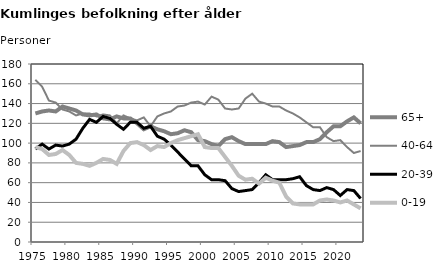
| Category | 65+ | 40-64 | 20-39 | 0-19 |
|---|---|---|---|---|
| 1975.0 | 130 | 164 | 94 | 96 |
| 1976.0 | 132 | 157 | 99 | 94 |
| 1977.0 | 133 | 143 | 94 | 88 |
| 1978.0 | 132 | 141 | 98 | 89 |
| 1979.0 | 137 | 134 | 97 | 93 |
| 1980.0 | 135 | 132 | 99 | 88 |
| 1981.0 | 133 | 128 | 104 | 80 |
| 1982.0 | 129 | 130 | 115 | 79 |
| 1983.0 | 128 | 130 | 124 | 77 |
| 1984.0 | 129 | 127 | 121 | 80 |
| 1985.0 | 125 | 129 | 127 | 84 |
| 1986.0 | 124 | 128 | 125 | 83 |
| 1987.0 | 127 | 120 | 119 | 79 |
| 1988.0 | 125 | 128 | 114 | 92 |
| 1989.0 | 125 | 125 | 121 | 100 |
| 1990.0 | 120 | 123 | 121 | 101 |
| 1991.0 | 114 | 126 | 115 | 98 |
| 1992.0 | 117 | 117 | 117 | 93 |
| 1993.0 | 114 | 127 | 107 | 97 |
| 1994.0 | 112 | 130 | 104 | 96 |
| 1995.0 | 109 | 132 | 98 | 100 |
| 1996.0 | 110 | 137 | 91 | 103 |
| 1997.0 | 113 | 138 | 84 | 105 |
| 1998.0 | 111 | 141 | 77 | 107 |
| 1999.0 | 103 | 142 | 77 | 109 |
| 2000.0 | 102 | 139 | 68 | 96 |
| 2001.0 | 99 | 147 | 63 | 95 |
| 2002.0 | 97 | 144 | 63 | 95 |
| 2003.0 | 104 | 135 | 62 | 86 |
| 2004.0 | 106 | 134 | 54 | 77 |
| 2005.0 | 102 | 135 | 51 | 67 |
| 2006.0 | 99 | 145 | 52 | 63 |
| 2007.0 | 99 | 150 | 53 | 64 |
| 2008.0 | 99 | 142 | 60 | 59 |
| 2009.0 | 99 | 140 | 68 | 65 |
| 2010.0 | 102 | 137 | 63 | 62 |
| 2011.0 | 101 | 137 | 63 | 60 |
| 2012.0 | 96 | 133 | 63 | 46 |
| 2013.0 | 97 | 130 | 64 | 39 |
| 2014.0 | 98 | 126 | 66 | 38 |
| 2015.0 | 101 | 121 | 57 | 38 |
| 2016.0 | 101 | 116 | 53 | 38 |
| 2017.0 | 104 | 116 | 52 | 42 |
| 2018.0 | 111 | 106 | 55 | 43 |
| 2019.0 | 117 | 102 | 53 | 42 |
| 2020.0 | 117 | 103 | 47 | 40 |
| 2021.0 | 122 | 96 | 53 | 42 |
| 2022.0 | 126 | 90 | 52 | 38 |
| 2023.0 | 120 | 92 | 44 | 34 |